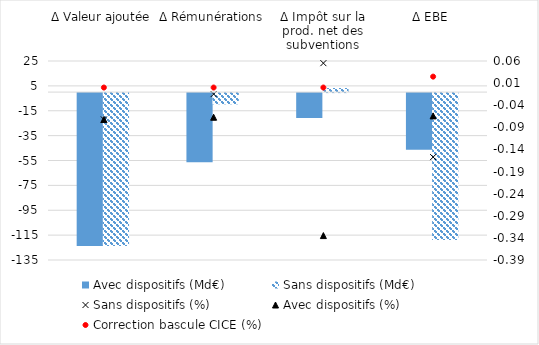
| Category | Avec dispositifs (Md€) | Sans dispositifs (Md€) |
|---|---|---|
| Δ Valeur ajoutée | -122.951 | -122.951 |
| Δ Rémunérations | -55.691 | -9.029 |
| Δ Impôt sur la prod. net des subventions | -20.024 | 3.298 |
| Δ EBE | -45.54 | -118.132 |